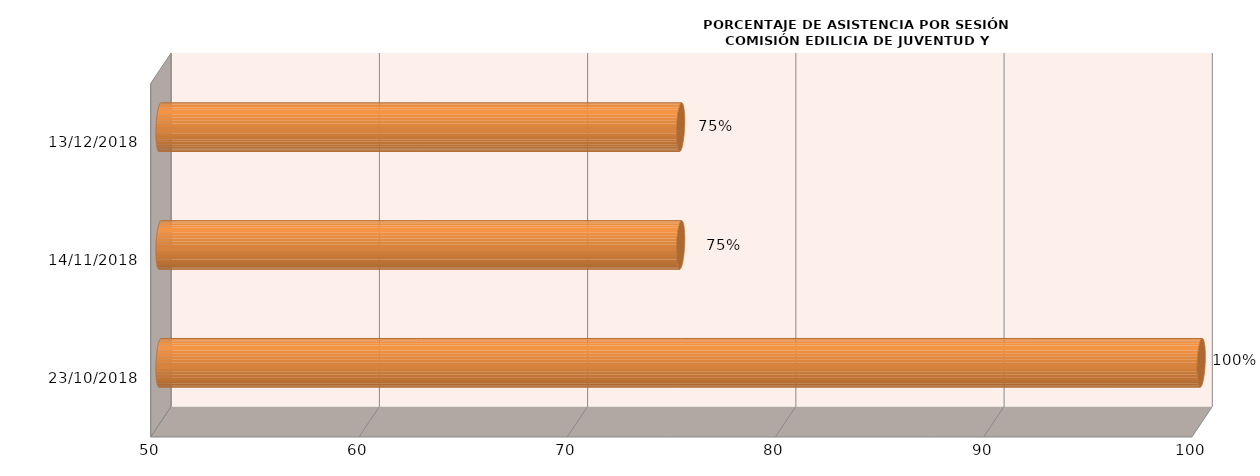
| Category | Series 0 |
|---|---|
| 23/10/2018 | 100 |
| 14/11/2018 | 75 |
| 13/12/2018 | 75 |